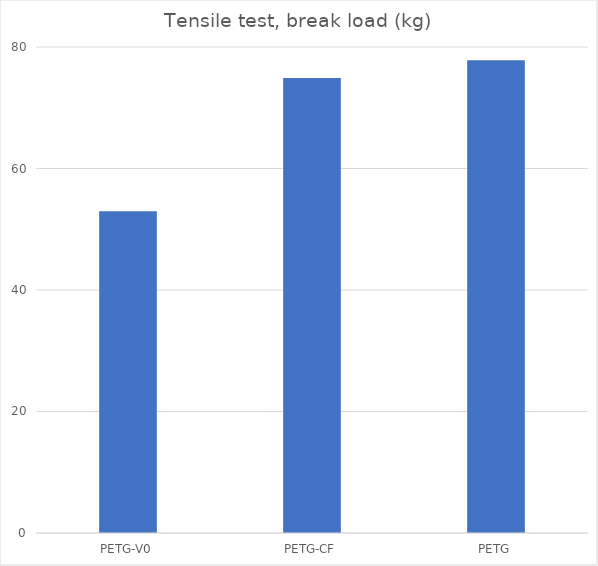
| Category | Average (kg) |
|---|---|
| PETG-V0 | 52.95 |
| PETG-CF | 74.9 |
| PETG | 77.8 |